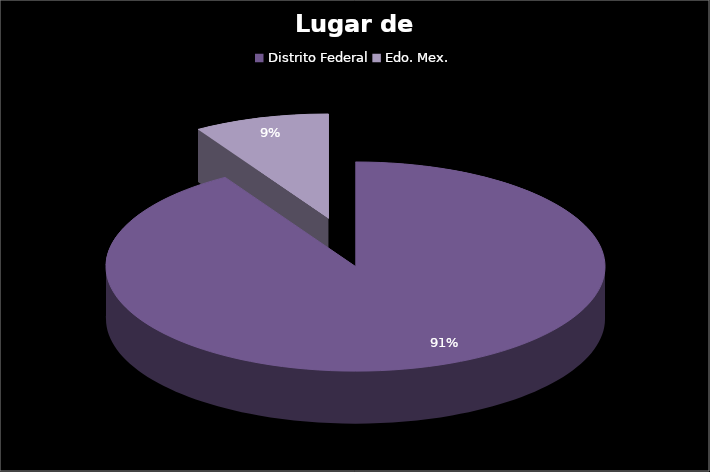
| Category | Series 0 |
|---|---|
| Distrito Federal | 73 |
| Edo. Mex. | 7 |